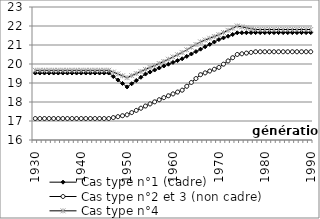
| Category | Cas type n°1 (cadre) | Cas type n°2 et 3 (non cadre) | Cas type n°4  |
|---|---|---|---|
| 1930.0 | 19.525 | 17.13 | 19.67 |
| 1931.0 | 19.525 | 17.13 | 19.67 |
| 1932.0 | 19.525 | 17.13 | 19.67 |
| 1933.0 | 19.525 | 17.13 | 19.67 |
| 1934.0 | 19.525 | 17.13 | 19.67 |
| 1935.0 | 19.525 | 17.13 | 19.67 |
| 1936.0 | 19.525 | 17.13 | 19.67 |
| 1937.0 | 19.525 | 17.13 | 19.67 |
| 1938.0 | 19.525 | 17.13 | 19.67 |
| 1939.0 | 19.525 | 17.13 | 19.67 |
| 1940.0 | 19.525 | 17.13 | 19.67 |
| 1941.0 | 19.525 | 17.13 | 19.67 |
| 1942.0 | 19.525 | 17.13 | 19.67 |
| 1943.0 | 19.525 | 17.13 | 19.67 |
| 1944.0 | 19.525 | 17.13 | 19.67 |
| 1945.0 | 19.525 | 17.13 | 19.67 |
| 1946.0 | 19.525 | 17.13 | 19.67 |
| 1947.0 | 19.342 | 17.179 | 19.572 |
| 1948.0 | 19.159 | 17.229 | 19.475 |
| 1949.0 | 18.976 | 17.278 | 19.378 |
| 1950.0 | 18.792 | 17.328 | 19.28 |
| 1951.0 | 18.962 | 17.442 | 19.389 |
| 1952.0 | 19.131 | 17.558 | 19.498 |
| 1953.0 | 19.301 | 17.672 | 19.606 |
| 1954.0 | 19.47 | 17.788 | 19.715 |
| 1955.0 | 19.576 | 17.898 | 19.819 |
| 1956.0 | 19.682 | 18.009 | 19.922 |
| 1957.0 | 19.789 | 18.119 | 20.026 |
| 1958.0 | 19.895 | 18.23 | 20.13 |
| 1959.0 | 19.99 | 18.328 | 20.249 |
| 1960.0 | 20.085 | 18.426 | 20.369 |
| 1961.0 | 20.18 | 18.524 | 20.488 |
| 1962.0 | 20.275 | 18.622 | 20.608 |
| 1963.0 | 20.401 | 18.826 | 20.747 |
| 1964.0 | 20.528 | 19.03 | 20.886 |
| 1965.0 | 20.654 | 19.234 | 21.026 |
| 1966.0 | 20.78 | 19.438 | 21.165 |
| 1967.0 | 20.906 | 19.533 | 21.259 |
| 1968.0 | 21.032 | 19.629 | 21.354 |
| 1969.0 | 21.159 | 19.724 | 21.448 |
| 1970.0 | 21.285 | 19.82 | 21.542 |
| 1971.0 | 21.374 | 19.991 | 21.657 |
| 1972.0 | 21.464 | 20.161 | 21.771 |
| 1973.0 | 21.553 | 20.332 | 21.886 |
| 1974.0 | 21.642 | 20.502 | 22 |
| 1975.0 | 21.645 | 20.538 | 21.954 |
| 1976.0 | 21.648 | 20.574 | 21.908 |
| 1977.0 | 21.65 | 20.609 | 21.861 |
| 1978.0 | 21.652 | 20.645 | 21.815 |
| 1979.0 | 21.652 | 20.645 | 21.815 |
| 1980.0 | 21.652 | 20.645 | 21.815 |
| 1981.0 | 21.652 | 20.645 | 21.815 |
| 1982.0 | 21.652 | 20.645 | 21.815 |
| 1983.0 | 21.652 | 20.645 | 21.815 |
| 1984.0 | 21.652 | 20.645 | 21.815 |
| 1985.0 | 21.652 | 20.645 | 21.815 |
| 1986.0 | 21.652 | 20.645 | 21.815 |
| 1987.0 | 21.652 | 20.645 | 21.815 |
| 1988.0 | 21.652 | 20.645 | 21.815 |
| 1989.0 | 21.652 | 20.645 | 21.815 |
| 1990.0 | 21.652 | 20.645 | 21.815 |